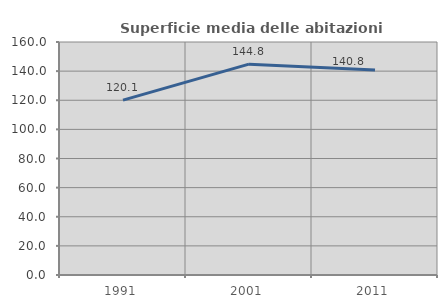
| Category | Superficie media delle abitazioni occupate |
|---|---|
| 1991.0 | 120.067 |
| 2001.0 | 144.768 |
| 2011.0 | 140.835 |